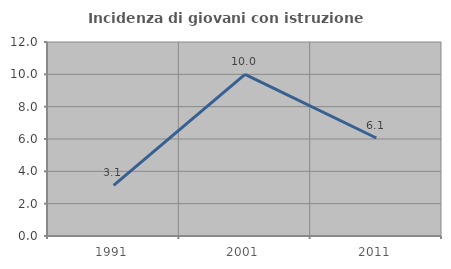
| Category | Incidenza di giovani con istruzione universitaria |
|---|---|
| 1991.0 | 3.125 |
| 2001.0 | 10 |
| 2011.0 | 6.061 |